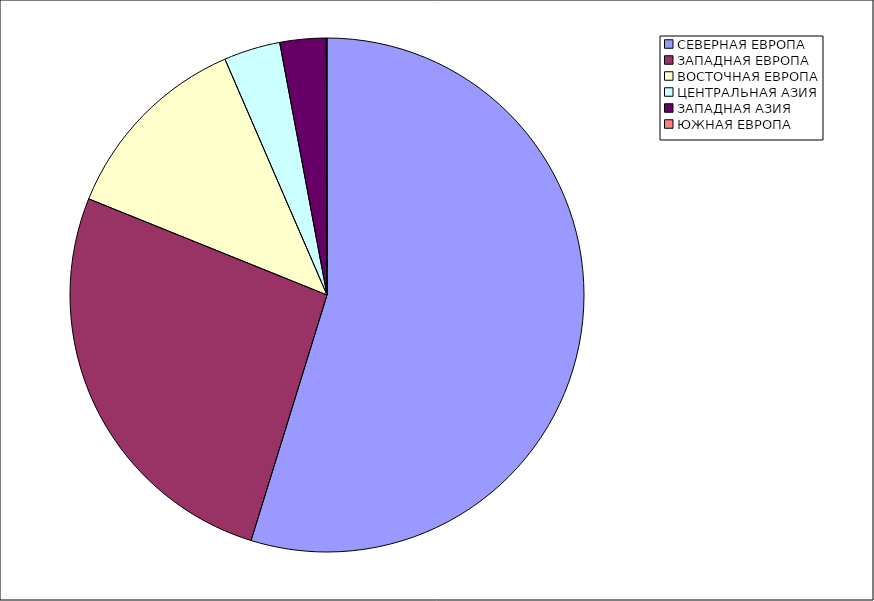
| Category | Оборот |
|---|---|
| СЕВЕРНАЯ ЕВРОПА | 54.78 |
| ЗАПАДНАЯ ЕВРОПА | 26.33 |
| ВОСТОЧНАЯ ЕВРОПА | 12.4 |
| ЦЕНТРАЛЬНАЯ АЗИЯ | 3.55 |
| ЗАПАДНАЯ АЗИЯ | 2.91 |
| ЮЖНАЯ ЕВРОПА | 0.04 |